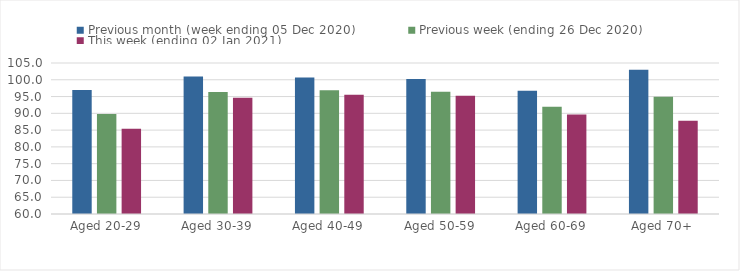
| Category | Previous month (week ending 05 Dec 2020) | Previous week (ending 26 Dec 2020) | This week (ending 02 Jan 2021) |
|---|---|---|---|
| Aged 20-29 | 96.95 | 89.77 | 85.37 |
| Aged 30-39 | 100.98 | 96.38 | 94.68 |
| Aged 40-49 | 100.69 | 96.88 | 95.55 |
| Aged 50-59 | 100.24 | 96.42 | 95.23 |
| Aged 60-69 | 96.74 | 91.97 | 89.62 |
| Aged 70+ | 103.02 | 94.96 | 87.82 |